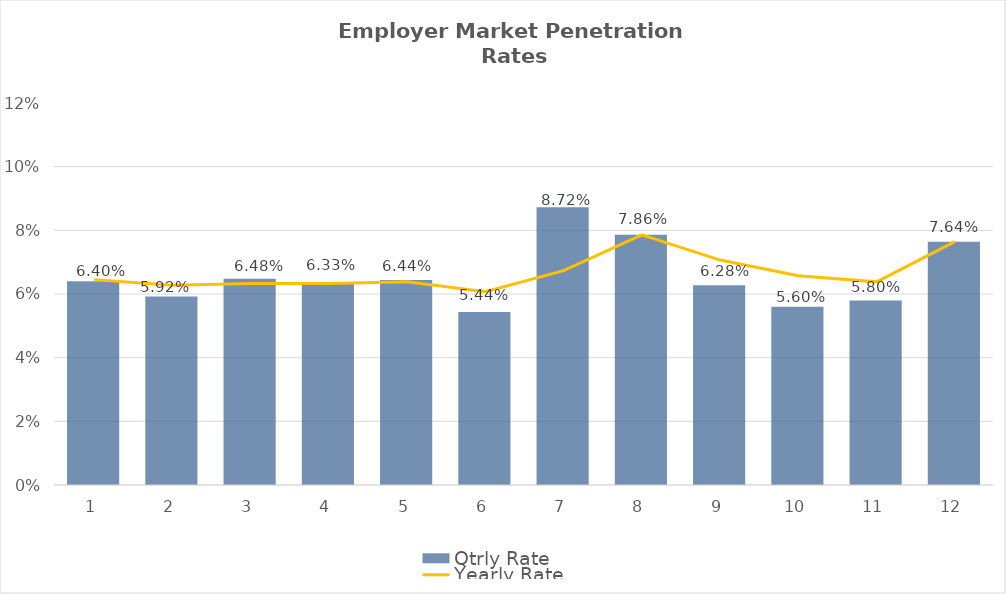
| Category | Qtrly Rate |
|---|---|
| 0 | 0.064 |
| 1 | 0.059 |
| 2 | 0.065 |
| 3 | 0.063 |
| 4 | 0.064 |
| 5 | 0.054 |
| 6 | 0.087 |
| 7 | 0.079 |
| 8 | 0.063 |
| 9 | 0.056 |
| 10 | 0.058 |
| 11 | 0.076 |